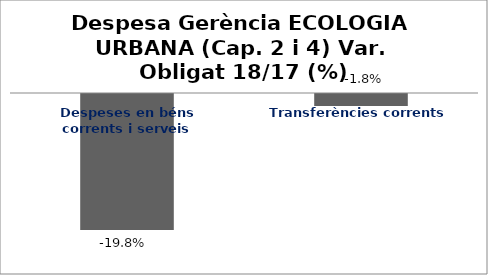
| Category | Series 0 |
|---|---|
| Despeses en béns corrents i serveis | -0.198 |
| Transferències corrents | -0.018 |